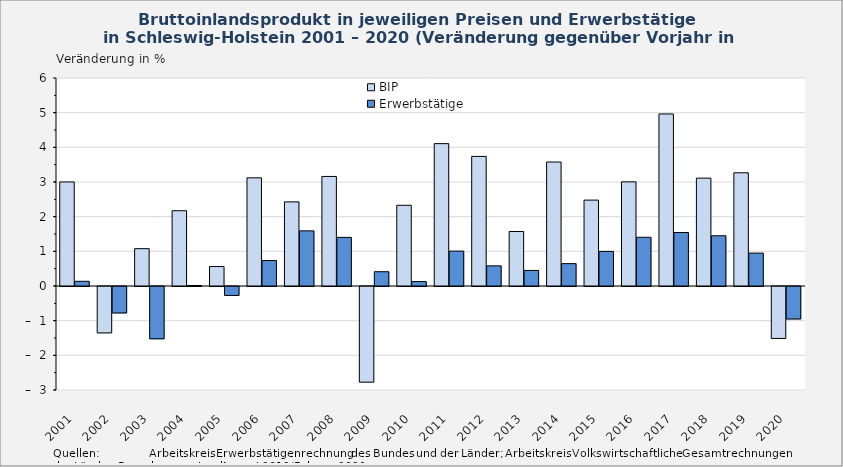
| Category | BIP | Erwerbstätige |
|---|---|---|
| 2001.0 | 3.001 | 0.135 |
| 2002.0 | -1.339 | -0.763 |
| 2003.0 | 1.077 | -1.508 |
| 2004.0 | 2.171 | 0.014 |
| 2005.0 | 0.562 | -0.258 |
| 2006.0 | 3.12 | 0.734 |
| 2007.0 | 2.427 | 1.591 |
| 2008.0 | 3.16 | 1.402 |
| 2009.0 | -2.759 | 0.412 |
| 2010.0 | 2.328 | 0.127 |
| 2011.0 | 4.107 | 1.007 |
| 2012.0 | 3.738 | 0.581 |
| 2013.0 | 1.573 | 0.449 |
| 2014.0 | 3.576 | 0.645 |
| 2015.0 | 2.478 | 0.998 |
| 2016.0 | 3.004 | 1.405 |
| 2017.0 | 4.963 | 1.543 |
| 2018.0 | 3.111 | 1.449 |
| 2019.0 | 3.266 | 0.949 |
| 2020.0 | -1.499 | -0.937 |